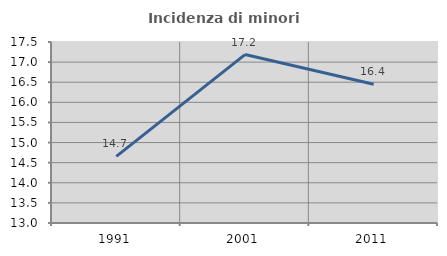
| Category | Incidenza di minori stranieri |
|---|---|
| 1991.0 | 14.655 |
| 2001.0 | 17.188 |
| 2011.0 | 16.448 |